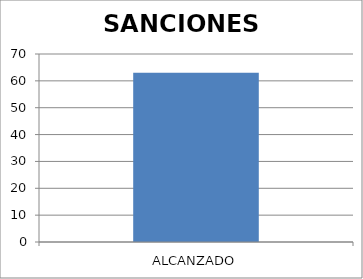
| Category | SANCIONES IMPUESTAS |
|---|---|
| ALCANZADO | 63 |